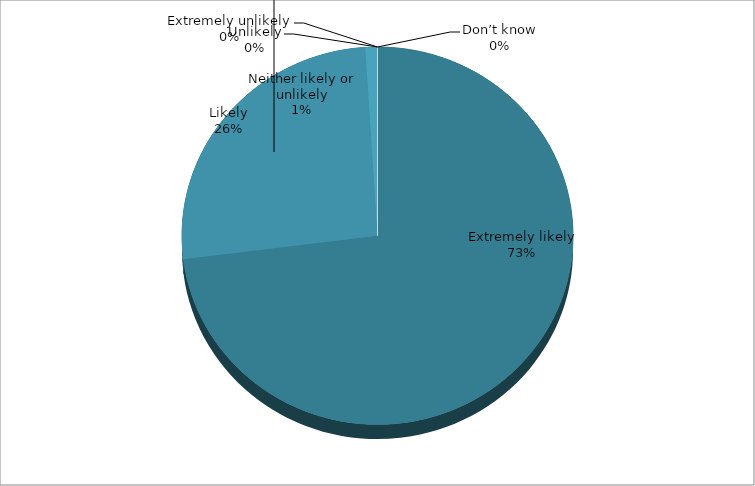
| Category | Series 0 |
|---|---|
| Extremely likely | 73 |
| Likely | 26 |
| Neither likely or unlikely | 1 |
| Unlikely | 0 |
| Extremely unlikely | 0 |
| Don’t know | 0 |